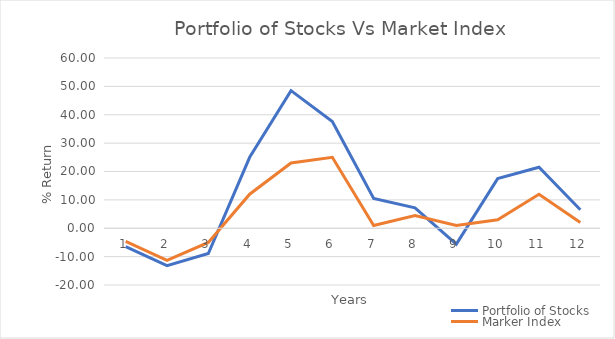
| Category | Portfolio of Stocks | Marker Index |
|---|---|---|
| 0 | -6.5 | -4.6 |
| 1 | -13.2 | -11.3 |
| 2 | -8.9 | -5 |
| 3 | 25 | 12 |
| 4 | 48.5 | 23 |
| 5 | 37.6 | 25 |
| 6 | 10.5 | 1 |
| 7 | 7.2 | 4.5 |
| 8 | -5.6 | 1 |
| 9 | 17.5 | 3 |
| 10 | 21.5 | 12 |
| 11 | 6.5 | 2 |